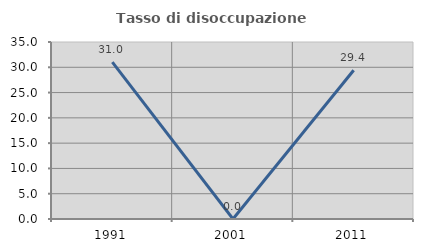
| Category | Tasso di disoccupazione giovanile  |
|---|---|
| 1991.0 | 31.034 |
| 2001.0 | 0 |
| 2011.0 | 29.412 |